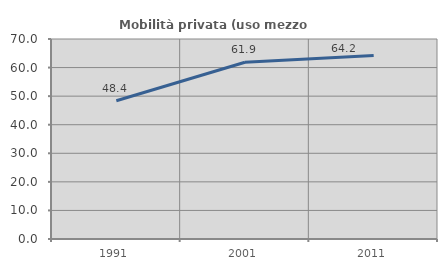
| Category | Mobilità privata (uso mezzo privato) |
|---|---|
| 1991.0 | 48.4 |
| 2001.0 | 61.864 |
| 2011.0 | 64.205 |